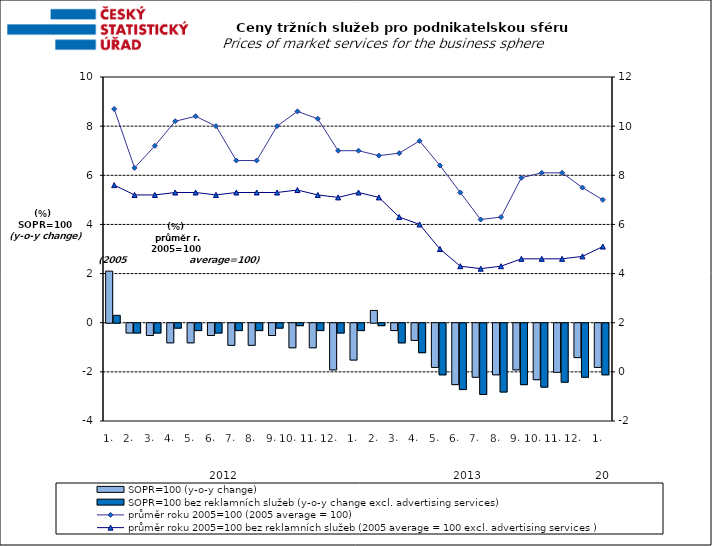
| Category | SOPR=100 (y-o-y change)   | SOPR=100 bez reklamních služeb (y-o-y change excl. advertising services)   |
|---|---|---|
| 0 | 2.1 | 0.3 |
| 1 | -0.4 | -0.4 |
| 2 | -0.5 | -0.4 |
| 3 | -0.8 | -0.2 |
| 4 | -0.8 | -0.3 |
| 5 | -0.5 | -0.4 |
| 6 | -0.9 | -0.3 |
| 7 | -0.9 | -0.3 |
| 8 | -0.5 | -0.2 |
| 9 | -1 | -0.1 |
| 10 | -1 | -0.3 |
| 11 | -1.9 | -0.4 |
| 12 | -1.5 | -0.3 |
| 13 | 0.5 | -0.1 |
| 14 | -0.3 | -0.8 |
| 15 | -0.7 | -1.2 |
| 16 | -1.8 | -2.1 |
| 17 | -2.5 | -2.7 |
| 18 | -2.2 | -2.9 |
| 19 | -2.1 | -2.8 |
| 20 | -1.9 | -2.5 |
| 21 | -2.3 | -2.6 |
| 22 | -2 | -2.4 |
| 23 | -1.4 | -2.2 |
| 24 | -1.8 | -2.1 |